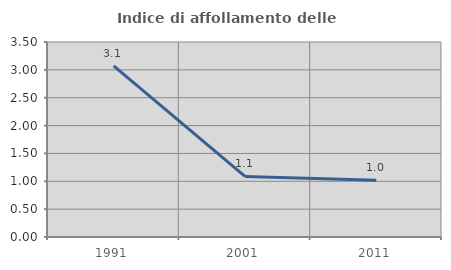
| Category | Indice di affollamento delle abitazioni  |
|---|---|
| 1991.0 | 3.073 |
| 2001.0 | 1.087 |
| 2011.0 | 1.018 |